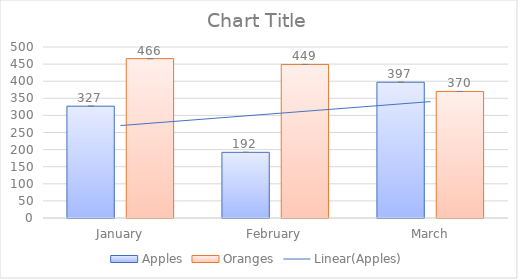
| Category | Apples | Oranges |
|---|---|---|
| January | 327 | 466 |
| February | 192 | 449 |
| March | 397 | 370 |